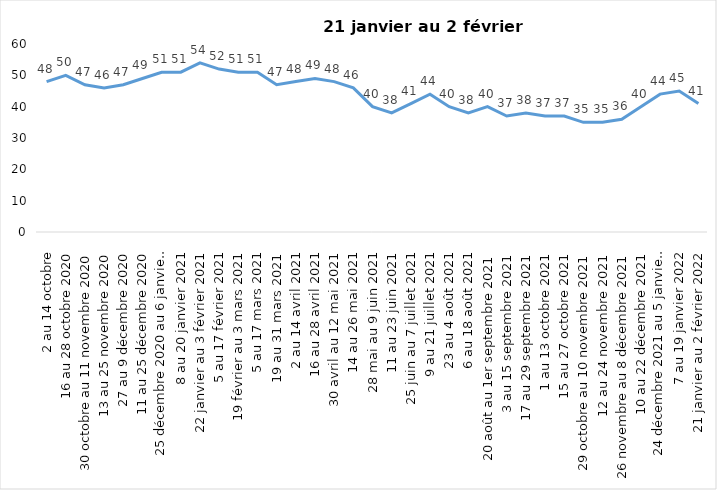
| Category | Toujours aux trois mesures |
|---|---|
| 2 au 14 octobre | 48 |
| 16 au 28 octobre 2020 | 50 |
| 30 octobre au 11 novembre 2020 | 47 |
| 13 au 25 novembre 2020 | 46 |
| 27 au 9 décembre 2020 | 47 |
| 11 au 25 décembre 2020 | 49 |
| 25 décembre 2020 au 6 janvier 2021 | 51 |
| 8 au 20 janvier 2021 | 51 |
| 22 janvier au 3 février 2021 | 54 |
| 5 au 17 février 2021 | 52 |
| 19 février au 3 mars 2021 | 51 |
| 5 au 17 mars 2021 | 51 |
| 19 au 31 mars 2021 | 47 |
| 2 au 14 avril 2021 | 48 |
| 16 au 28 avril 2021 | 49 |
| 30 avril au 12 mai 2021 | 48 |
| 14 au 26 mai 2021 | 46 |
| 28 mai au 9 juin 2021 | 40 |
| 11 au 23 juin 2021 | 38 |
| 25 juin au 7 juillet 2021 | 41 |
| 9 au 21 juillet 2021 | 44 |
| 23 au 4 août 2021 | 40 |
| 6 au 18 août 2021 | 38 |
| 20 août au 1er septembre 2021 | 40 |
| 3 au 15 septembre 2021 | 37 |
| 17 au 29 septembre 2021 | 38 |
| 1 au 13 octobre 2021 | 37 |
| 15 au 27 octobre 2021 | 37 |
| 29 octobre au 10 novembre 2021 | 35 |
| 12 au 24 novembre 2021 | 35 |
| 26 novembre au 8 décembre 2021 | 36 |
| 10 au 22 décembre 2021 | 40 |
| 24 décembre 2021 au 5 janvier 2022 | 44 |
| 7 au 19 janvier 2022 | 45 |
| 21 janvier au 2 février 2022 | 41 |